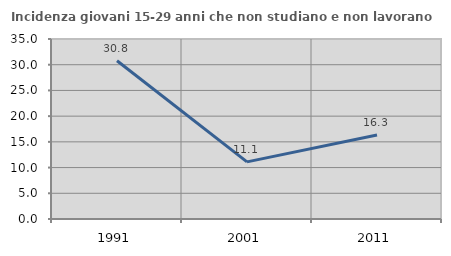
| Category | Incidenza giovani 15-29 anni che non studiano e non lavorano  |
|---|---|
| 1991.0 | 30.769 |
| 2001.0 | 11.111 |
| 2011.0 | 16.346 |